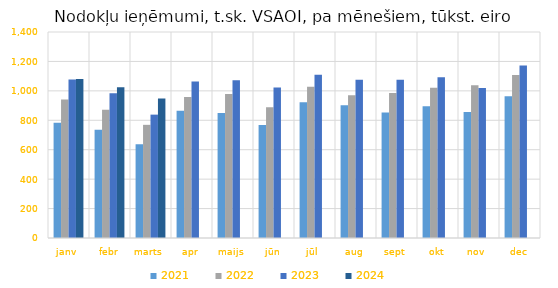
| Category | 2021 | 2022 | 2023 | 2024 |
|---|---|---|---|---|
| janv | 782986.001 | 941791.936 | 1077162.761 | 1080454.102 |
| febr | 734852.065 | 870814.989 | 983504.244 | 1024283.855 |
| marts | 637891.51 | 769054.685 | 838446.19 | 948366.56 |
| apr | 864350.424 | 957835.152 | 1063867.001 | 0 |
| maijs | 850252.991 | 978678.559 | 1071795.241 | 0 |
| jūn | 768738.388 | 888916.233 | 1023214.676 | 0 |
| jūl | 922262.256 | 1027456.888 | 1108668.131 | 0 |
| aug | 901674.184 | 969994.081 | 1074853.308 | 0 |
| sept | 852725.586 | 985435.904 | 1074818.769 | 0 |
| okt | 895873.595 | 1021662.514 | 1092402.095 | 0 |
| nov | 856461.1 | 1038227.674 | 1019073.949 | 0 |
| dec | 962936.043 | 1107409.079 | 1172609.23 | 0 |